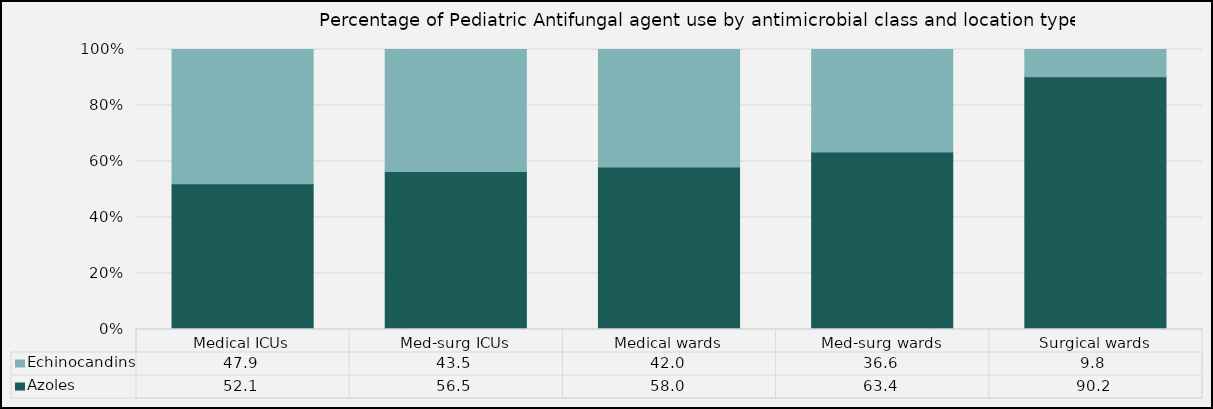
| Category | Azoles | Echinocandins |
|---|---|---|
| Medical ICUs | 52.08 | 47.92 |
| Med-surg ICUs | 56.47 | 43.53 |
| Medical wards | 58.03 | 41.97 |
| Med-surg wards | 63.41 | 36.59 |
| Surgical wards | 90.24 | 9.76 |